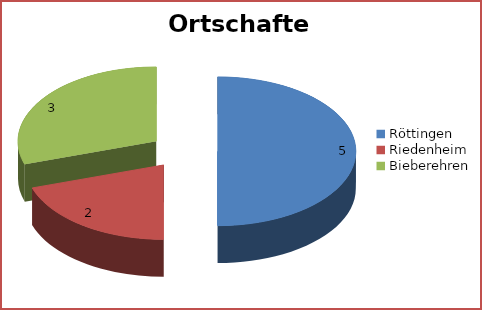
| Category | Series 0 |
|---|---|
| Röttingen | 5 |
| Riedenheim | 2 |
| Bieberehren | 4 |